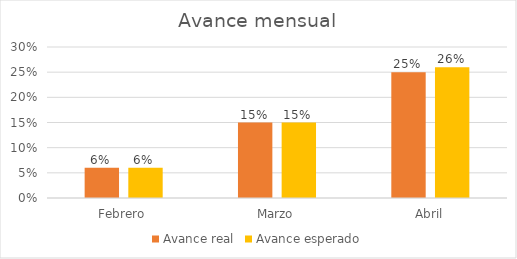
| Category | Avance real | Avance esperado |
|---|---|---|
| Febrero | 0.06 | 0.06 |
| Marzo | 0.15 | 0.15 |
| Abril | 0.25 | 0.26 |